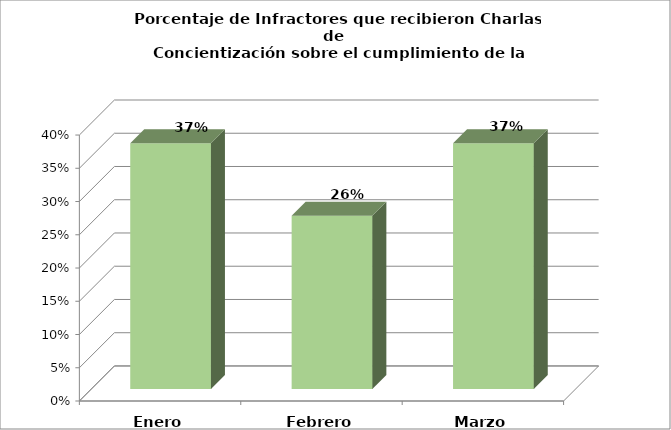
| Category | Series 0 |
|---|---|
| Enero | 0.37 |
| Febrero | 0.261 |
| Marzo | 0.37 |